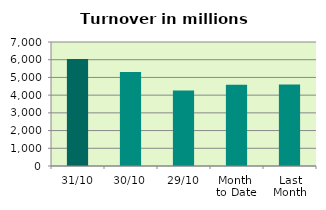
| Category | Series 0 |
|---|---|
| 31/10 | 6045.313 |
| 30/10 | 5307.956 |
| 29/10 | 4266.923 |
| Month 
to Date | 4589.98 |
| Last
Month | 4598.075 |